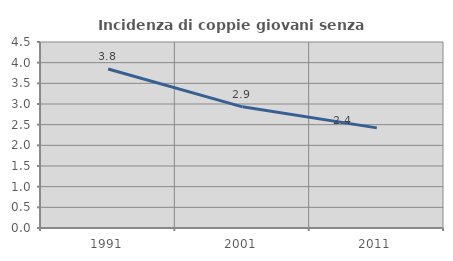
| Category | Incidenza di coppie giovani senza figli |
|---|---|
| 1991.0 | 3.846 |
| 2001.0 | 2.932 |
| 2011.0 | 2.422 |